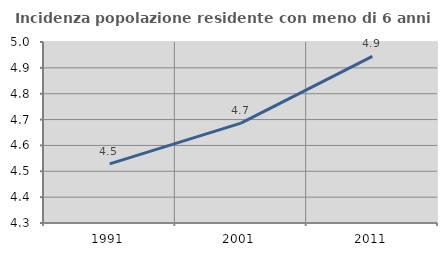
| Category | Incidenza popolazione residente con meno di 6 anni |
|---|---|
| 1991.0 | 4.529 |
| 2001.0 | 4.686 |
| 2011.0 | 4.944 |